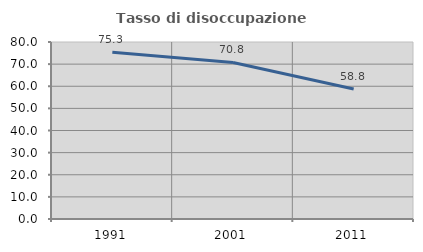
| Category | Tasso di disoccupazione giovanile  |
|---|---|
| 1991.0 | 75.344 |
| 2001.0 | 70.76 |
| 2011.0 | 58.75 |